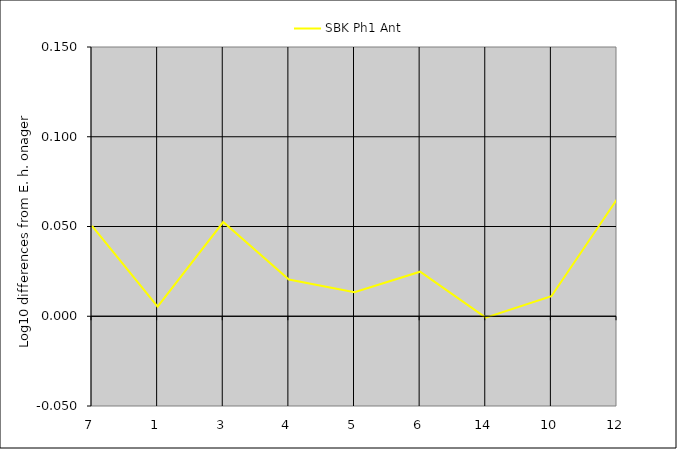
| Category | SBK Ph1 Ant |
|---|---|
| 7.0 | 0.05 |
| 1.0 | 0.005 |
| 3.0 | 0.052 |
| 4.0 | 0.02 |
| 5.0 | 0.013 |
| 6.0 | 0.025 |
| 14.0 | -0.001 |
| 10.0 | 0.011 |
| 12.0 | 0.065 |